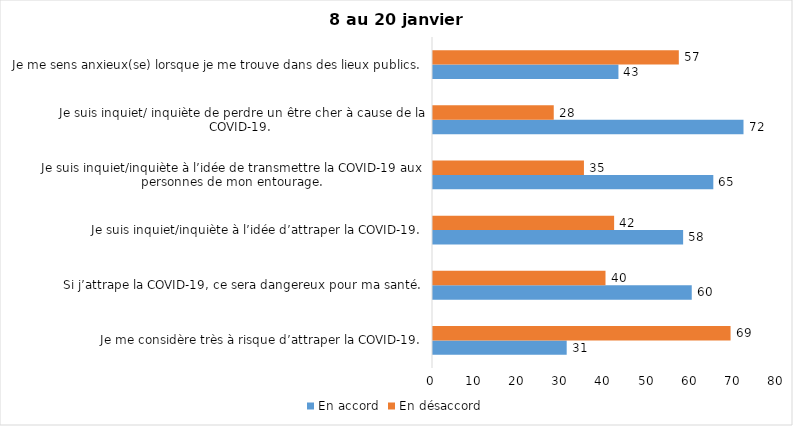
| Category | En accord | En désaccord |
|---|---|---|
| Je me considère très à risque d’attraper la COVID-19. | 31 | 69 |
| Si j’attrape la COVID-19, ce sera dangereux pour ma santé. | 60 | 40 |
| Je suis inquiet/inquiète à l’idée d’attraper la COVID-19. | 58 | 42 |
| Je suis inquiet/inquiète à l’idée de transmettre la COVID-19 aux personnes de mon entourage. | 65 | 35 |
| Je suis inquiet/ inquiète de perdre un être cher à cause de la COVID-19. | 72 | 28 |
| Je me sens anxieux(se) lorsque je me trouve dans des lieux publics. | 43 | 57 |